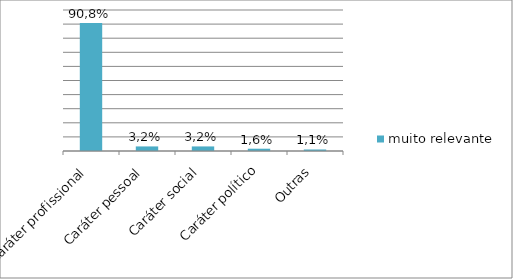
| Category | muito relevante | relevante |
|---|---|---|
| Caráter profissional | 90.811 |  |
| Caráter pessoal | 3.243 |  |
| Caráter social | 3.243 |  |
| Caráter político | 1.622 |  |
| Outras | 1.081 |  |